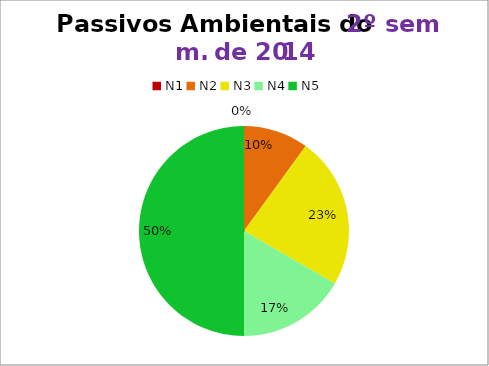
| Category | 2º/14 |
|---|---|
| N1 | 0 |
| N2 | 3 |
| N3 | 7 |
| N4 | 5 |
| N5 | 15 |